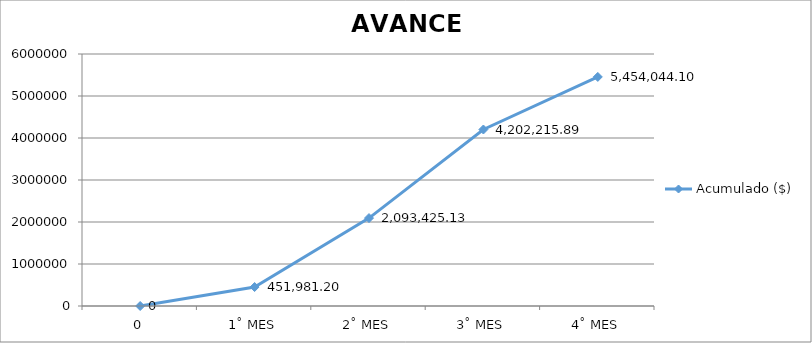
| Category | Acumulado ($) |
|---|---|
| 0 | 0 |
| 1˚ MES | 451981.2 |
| 2˚ MES | 2093425.13 |
| 3˚ MES | 4202215.889 |
| 4˚ MES | 5454044.098 |